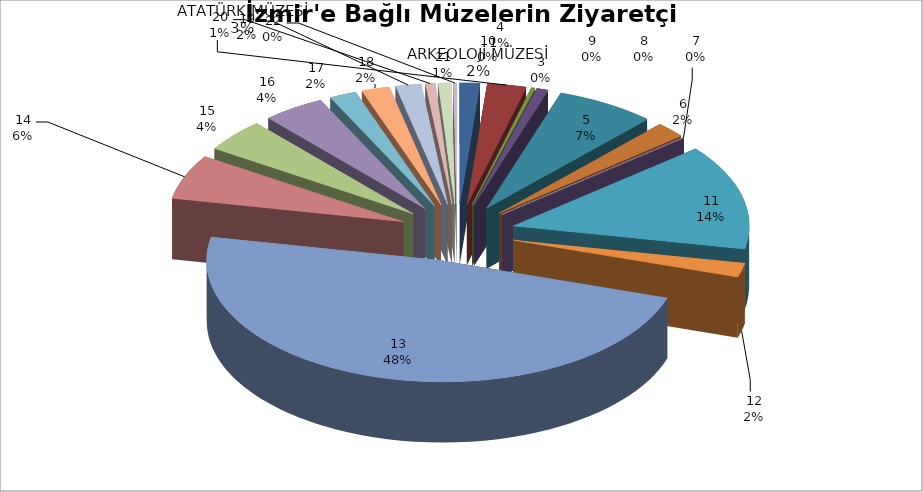
| Category | Series 0 |
|---|---|
| 0 | 2507 |
| 1 | 4865 |
| 2 | 469 |
| 3 | 1445 |
| 4 | 12472 |
| 5 | 3798 |
| 6 | 75 |
| 7 | 0 |
| 8 | 0 |
| 9 | 0 |
| 10 | 25631 |
| 11 | 3410 |
| 12 | 88016 |
| 13 | 10875 |
| 14 | 8007 |
| 15 | 7781 |
| 16 | 3362 |
| 17 | 3488 |
| 18 | 3185 |
| 19 | 1212 |
| 20 | 1617 |
| 21 | 440 |